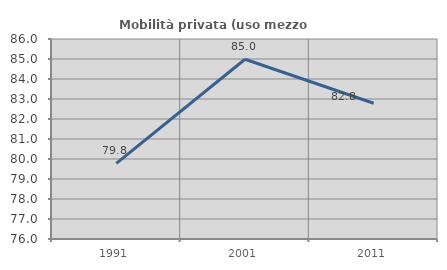
| Category | Mobilità privata (uso mezzo privato) |
|---|---|
| 1991.0 | 79.781 |
| 2001.0 | 84.989 |
| 2011.0 | 82.789 |